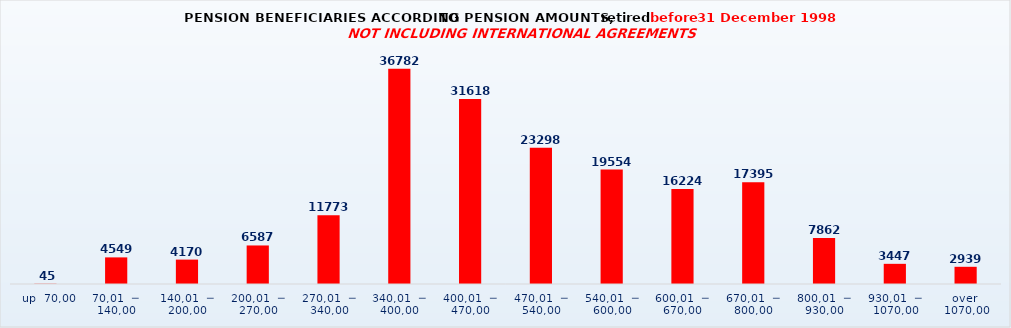
| Category | Series 0 |
|---|---|
|   up  70,00 | 45 |
| 70,01  ─  140,00 | 4549 |
| 140,01  ─  200,00 | 4170 |
| 200,01  ─  270,00 | 6587 |
| 270,01  ─  340,00 | 11773 |
| 340,01  ─  400,00 | 36782 |
| 400,01  ─  470,00 | 31618 |
| 470,01  ─  540,00 | 23298 |
| 540,01  ─  600,00 | 19554 |
| 600,01  ─  670,00 | 16224 |
| 670,01  ─  800,00 | 17395 |
| 800,01  ─  930,00 | 7862 |
| 930,01  ─  1070,00 | 3447 |
| over  1070,00 | 2939 |